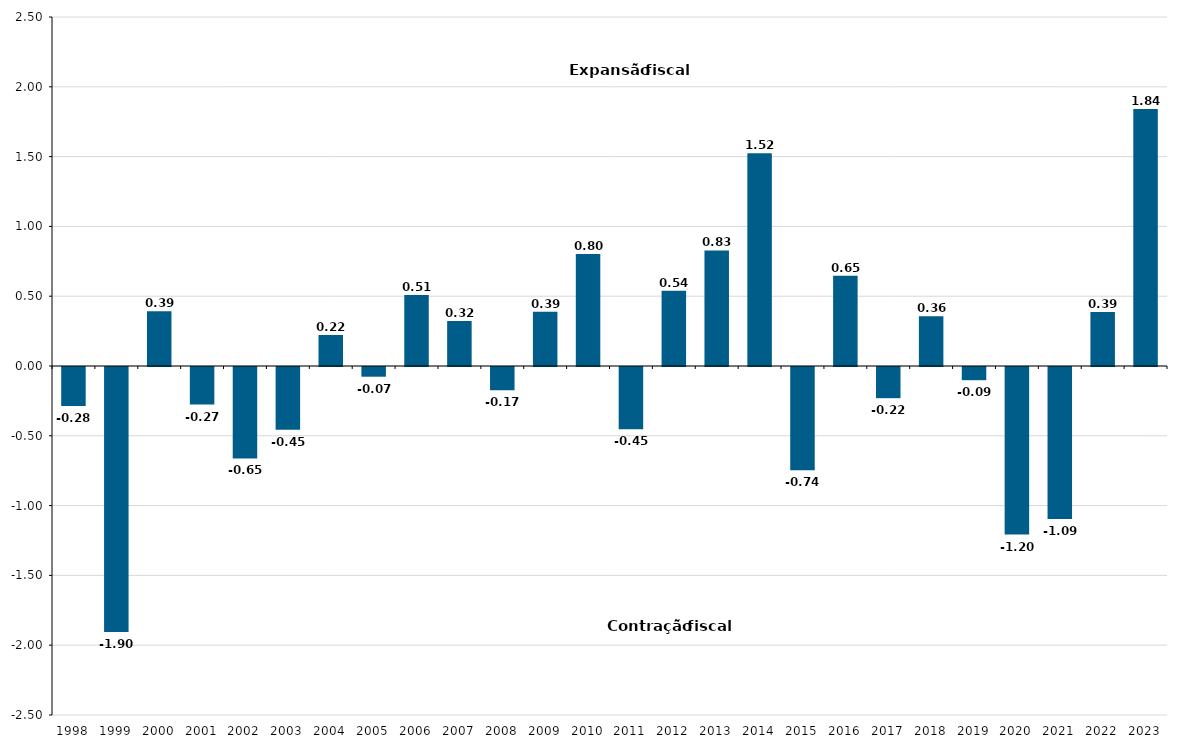
| Category | Impulso Fiscal |
|---|---|
| 1998.0 | -0.279 |
| 1999.0 | -1.898 |
| 2000.0 | 0.393 |
| 2001.0 | -0.269 |
| 2002.0 | -0.655 |
| 2003.0 | -0.45 |
| 2004.0 | 0.222 |
| 2005.0 | -0.07 |
| 2006.0 | 0.509 |
| 2007.0 | 0.323 |
| 2008.0 | -0.167 |
| 2009.0 | 0.389 |
| 2010.0 | 0.803 |
| 2011.0 | -0.445 |
| 2012.0 | 0.539 |
| 2013.0 | 0.828 |
| 2014.0 | 1.524 |
| 2015.0 | -0.74 |
| 2016.0 | 0.646 |
| 2017.0 | -0.223 |
| 2018.0 | 0.356 |
| 2019.0 | -0.095 |
| 2020.0 | -1.2 |
| 2021.0 | -1.089 |
| 2022.0 | 0.387 |
| 2023.0 | 1.84 |